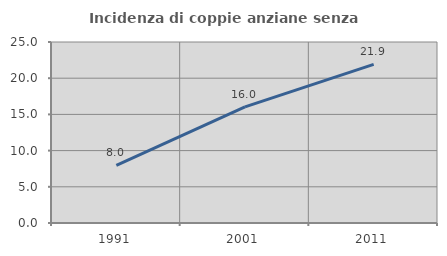
| Category | Incidenza di coppie anziane senza figli  |
|---|---|
| 1991.0 | 7.955 |
| 2001.0 | 16.049 |
| 2011.0 | 21.918 |